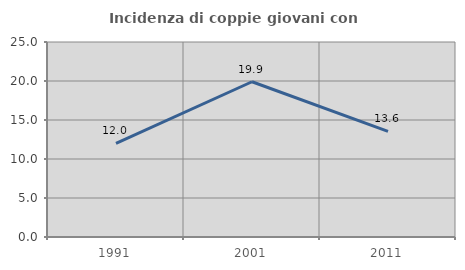
| Category | Incidenza di coppie giovani con figli |
|---|---|
| 1991.0 | 12 |
| 2001.0 | 19.903 |
| 2011.0 | 13.551 |